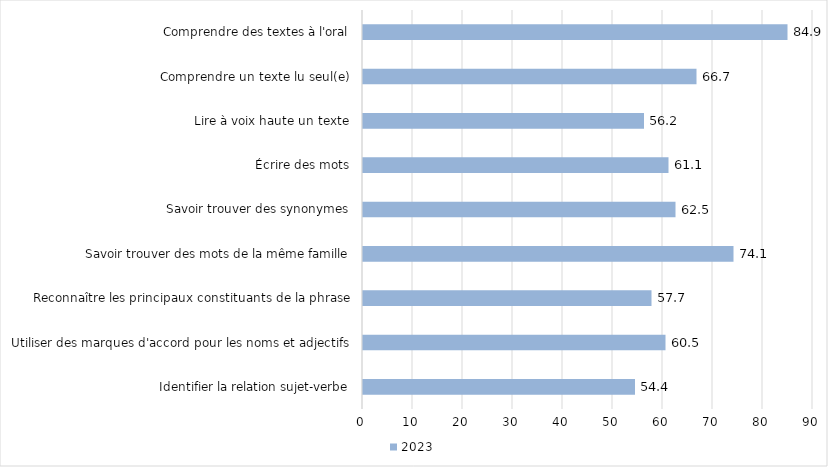
| Category | 2023 |
|---|---|
| Identifier la relation sujet-verbe | 54.4 |
| Utiliser des marques d'accord pour les noms et adjectifs | 60.5 |
| Reconnaître les principaux constituants de la phrase | 57.7 |
| Savoir trouver des mots de la même famille | 74.1 |
| Savoir trouver des synonymes | 62.5 |
| Écrire des mots | 61.1 |
| Lire à voix haute un texte | 56.2 |
| Comprendre un texte lu seul(e) | 66.7 |
| Comprendre des textes à l'oral | 84.9 |